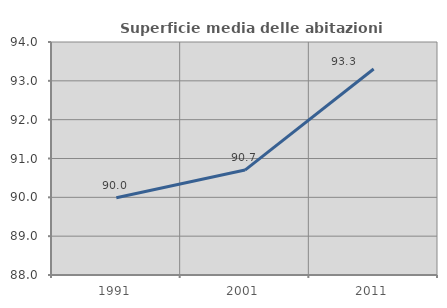
| Category | Superficie media delle abitazioni occupate |
|---|---|
| 1991.0 | 89.989 |
| 2001.0 | 90.702 |
| 2011.0 | 93.304 |